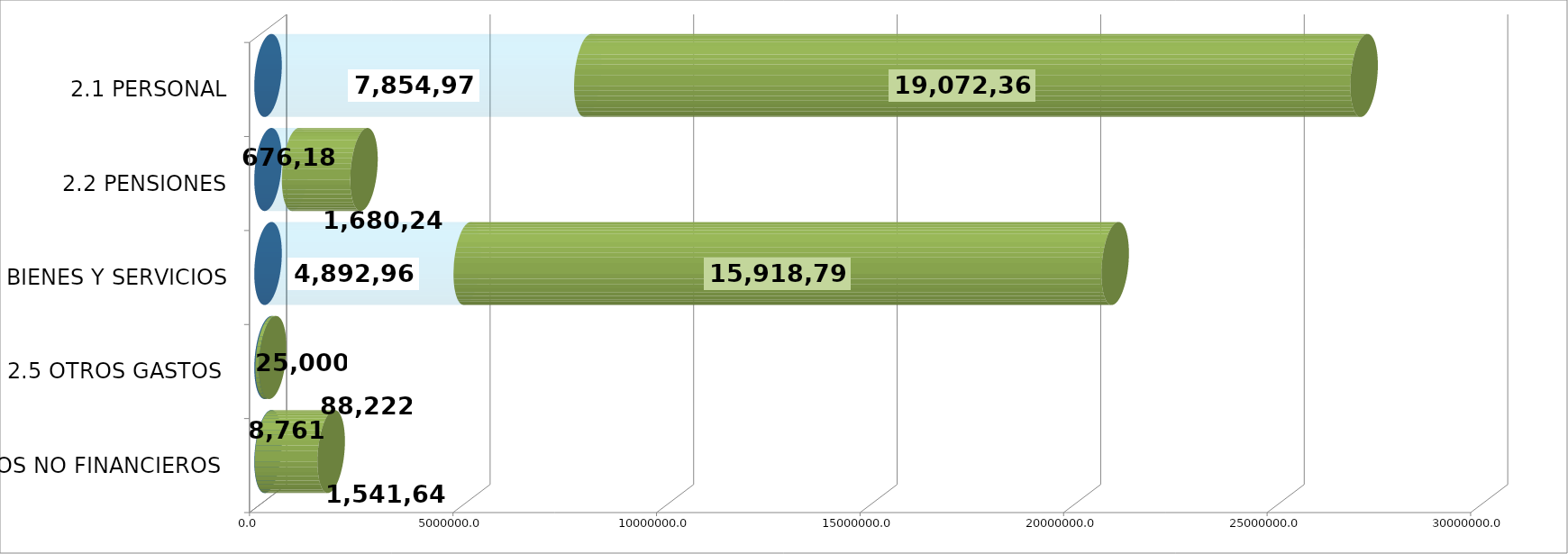
| Category | GENERICA | EJECUTADO | SALDO  |
|---|---|---|---|
| 2.1 PERSONAL | 0 | 7854970.35 | 19072362.65 |
| 2.2 PENSIONES | 0 | 676180.72 | 1680241.28 |
| 2.3 BIENES Y SERVICIOS | 0 | 4892959.68 | 15918791.32 |
| 2.5 OTROS GASTOS  | 0 | 25000 | 88222 |
| 2.6 ACTIVOS NO FINANCIEROS  | 0 | 8760.5 | 1541645.5 |